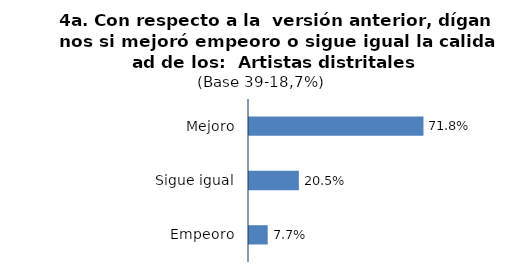
| Category | Series 0 |
|---|---|
| Mejoro | 0.718 |
| Sigue igual | 0.205 |
| Empeoro | 0.077 |